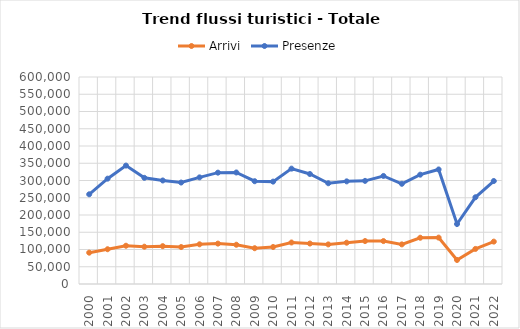
| Category | Arrivi | Presenze |
|---|---|---|
| 2000.0 | 90805 | 259999 |
| 2001.0 | 100780 | 305343 |
| 2002.0 | 110929 | 343231 |
| 2003.0 | 108125 | 307680 |
| 2004.0 | 109703 | 300065 |
| 2005.0 | 107154 | 294079 |
| 2006.0 | 115080 | 309065 |
| 2007.0 | 117088 | 322757 |
| 2008.0 | 113811 | 323279 |
| 2009.0 | 103741 | 297922 |
| 2010.0 | 107291 | 296752 |
| 2011.0 | 120299 | 334356 |
| 2012.0 | 117299 | 318858 |
| 2013.0 | 114787 | 292046 |
| 2014.0 | 119723 | 297489 |
| 2015.0 | 124520 | 298920 |
| 2016.0 | 124438 | 313158 |
| 2017.0 | 114859 | 290476 |
| 2018.0 | 134067 | 316901 |
| 2019.0 | 134450 | 332012 |
| 2020.0 | 69639 | 173806 |
| 2021.0 | 101673 | 251366 |
| 2022.0 | 122832 | 298488 |